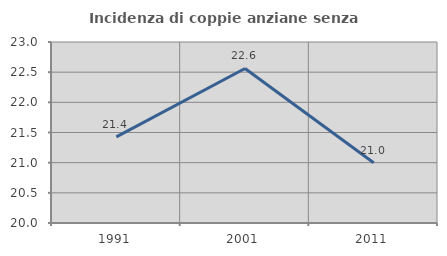
| Category | Incidenza di coppie anziane senza figli  |
|---|---|
| 1991.0 | 21.429 |
| 2001.0 | 22.561 |
| 2011.0 | 21 |